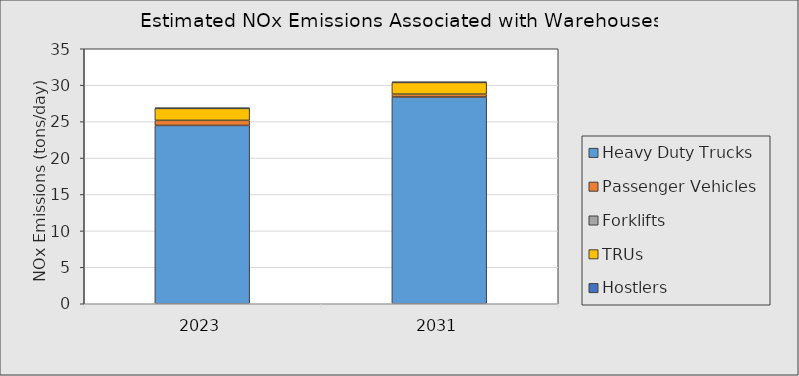
| Category | Heavy Duty Trucks | Passenger Vehicles | Forklifts | TRUs | Hostlers |
|---|---|---|---|---|---|
| 2023.0 | 24.477 | 0.697 | 0 | 1.638 | 0.085 |
| 2031.0 | 28.378 | 0.39 | 0 | 1.608 | 0.082 |